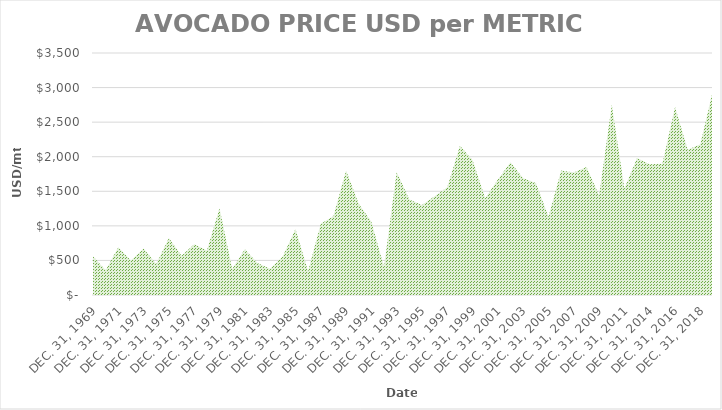
| Category | Precio |
|---|---|
| Dec. 31, 1969 | 561 |
| Dec. 31, 1970 | 357 |
| Dec. 31, 1971 | 691 |
| Dec. 31, 1972 | 499 |
| Dec. 31, 1973 | 672 |
| Dec. 31, 1974 | 450 |
| Dec. 31, 1975 | 826 |
| Dec. 31, 1976 | 566 |
| Dec. 31, 1977 | 735 |
| Dec. 31, 1978 | 645 |
| Dec. 31, 1979 | 1256 |
| Dec. 31, 1980 | 377 |
| Dec. 31, 1981 | 662 |
| Dec. 31, 1982 | 463 |
| Dec. 31, 1983 | 379 |
| Dec. 31, 1984 | 557 |
| Dec. 31, 1985 | 953 |
| Dec. 31, 1986 | 344 |
| Dec. 31, 1987 | 1030 |
| Dec. 31, 1988 | 1140 |
| Dec. 31, 1989 | 1800 |
| Dec. 31, 1990 | 1320 |
| Dec. 31, 1991 | 1060 |
| Dec. 31, 1992 | 405 |
| Dec. 31, 1993 | 1780 |
| Dec. 31, 1994 | 1380 |
| Dec. 31, 1995 | 1300 |
| Dec. 31, 1996 | 1430 |
| Dec. 31, 1997 | 1560 |
| Dec. 31, 1998 | 2160 |
| Dec. 31, 1999 | 1950 |
| Dec. 31, 2000 | 1400 |
| Dec. 31, 2001 | 1670 |
| Dec. 31, 2002 | 1920 |
| Dec. 31, 2003 | 1690 |
| Dec. 31, 2004 | 1620 |
| Dec. 31, 2005 | 1130 |
| Dec. 31, 2006 | 1800 |
| Dec. 31, 2007 | 1770 |
| Dec. 31, 2008 | 1850 |
| Dec. 31, 2009 | 1440 |
| Dec. 31, 2010 | 2750 |
| Dec. 31, 2011 | 1540 |
| Dec. 31, 2013 | 1980 |
| Dec. 31, 2014 | 1890 |
| Dec. 31, 2015 | 1900 |
| Dec. 31, 2016 | 2720 |
| Dec. 31, 2017 | 2100 |
| Dec. 31, 2018 | 2180 |
| Dec. 31, 2019 | 2960 |